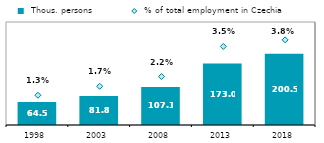
| Category |  Thous. persons |
|---|---|
| 1998.0 | 64.531 |
| 2003.0 | 81.809 |
| 2008.0 | 107.113 |
| 2013.0 | 173.04 |
| 2018.0 | 200.46 |